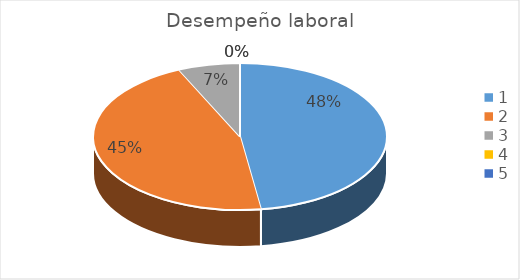
| Category | Series 0 |
|---|---|
| 0 | 0.477 |
| 1 | 0.455 |
| 2 | 0.068 |
| 3 | 0 |
| 4 | 0 |